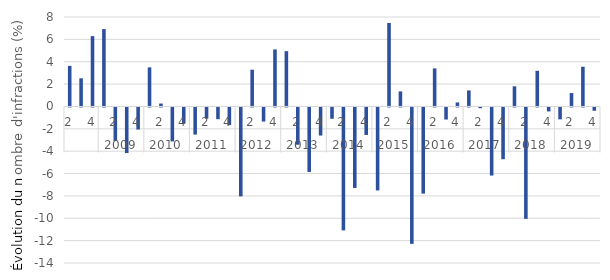
| Category | évolution trimestrielle (%) |
|---|---|
| 0 | 3.631 |
| 1 | 2.516 |
| 2 | 6.29 |
| 3 | 6.92 |
| 4 | -3.001 |
| 5 | -4.076 |
| 6 | -1.973 |
| 7 | 3.497 |
| 8 | 0.261 |
| 9 | -3.038 |
| 10 | -1.421 |
| 11 | -2.426 |
| 12 | -1 |
| 13 | -1.049 |
| 14 | -1.58 |
| 15 | -7.952 |
| 16 | 3.285 |
| 17 | -1.261 |
| 18 | 5.099 |
| 19 | 4.944 |
| 20 | -3.332 |
| 21 | -5.765 |
| 22 | -2.513 |
| 23 | -1.009 |
| 24 | -10.993 |
| 25 | -7.198 |
| 26 | -2.46 |
| 27 | -7.421 |
| 28 | 7.463 |
| 29 | 1.347 |
| 30 | -12.199 |
| 31 | -7.705 |
| 32 | 3.404 |
| 33 | -1.077 |
| 34 | 0.358 |
| 35 | 1.435 |
| 36 | -0.069 |
| 37 | -6.089 |
| 38 | -4.629 |
| 39 | 1.802 |
| 40 | -9.962 |
| 41 | 3.189 |
| 42 | -0.353 |
| 43 | -1.064 |
| 44 | 1.198 |
| 45 | 3.553 |
| 46 | -0.296 |